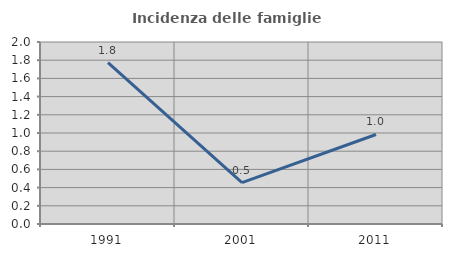
| Category | Incidenza delle famiglie numerose |
|---|---|
| 1991.0 | 1.774 |
| 2001.0 | 0.454 |
| 2011.0 | 0.984 |